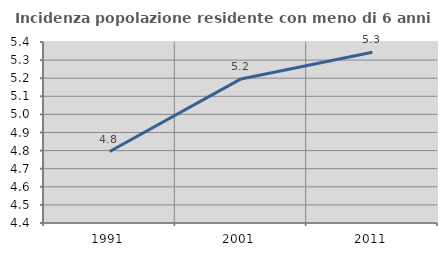
| Category | Incidenza popolazione residente con meno di 6 anni |
|---|---|
| 1991.0 | 4.795 |
| 2001.0 | 5.196 |
| 2011.0 | 5.343 |